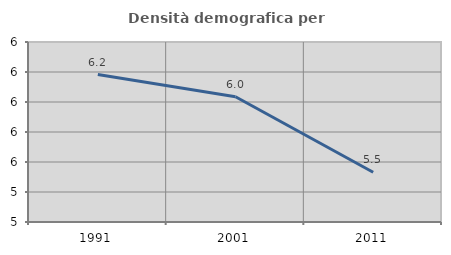
| Category | Densità demografica |
|---|---|
| 1991.0 | 6.183 |
| 2001.0 | 6.035 |
| 2011.0 | 5.532 |